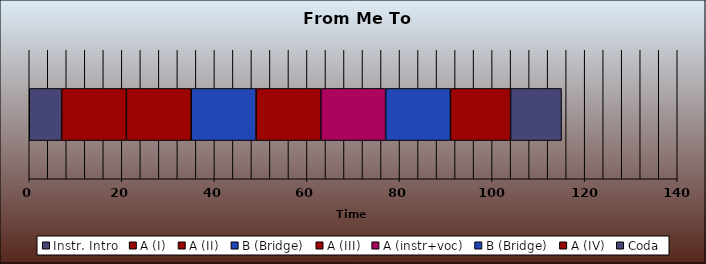
| Category | Instr. Intro | A (I) | A (II) | B (Bridge) | A (III) | A (instr+voc) | A (IV) | Coda |
|---|---|---|---|---|---|---|---|---|
| 0 | 7 | 14 | 14 | 14 | 14 | 14 | 13 | 11 |